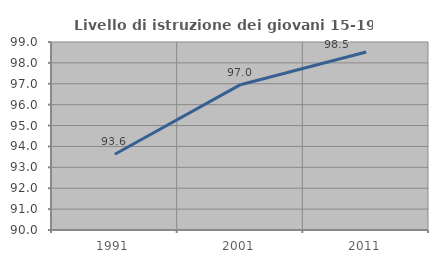
| Category | Livello di istruzione dei giovani 15-19 anni |
|---|---|
| 1991.0 | 93.624 |
| 2001.0 | 96.957 |
| 2011.0 | 98.522 |